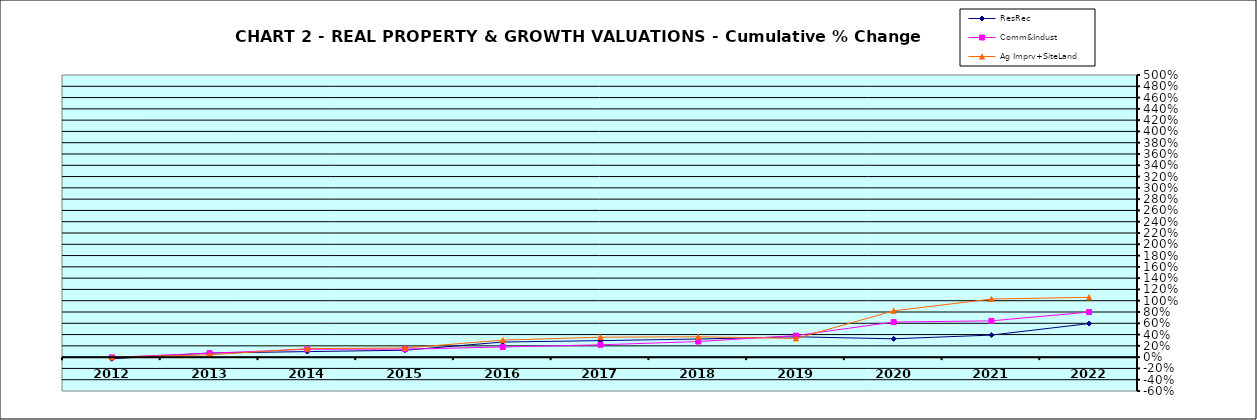
| Category | ResRec | Comm&Indust | Ag Imprv+SiteLand |
|---|---|---|---|
| 2012.0 | -0.029 | -0.004 | 0 |
| 2013.0 | 0.073 | 0.07 | 0.042 |
| 2014.0 | 0.098 | 0.14 | 0.151 |
| 2015.0 | 0.123 | 0.142 | 0.162 |
| 2016.0 | 0.268 | 0.18 | 0.302 |
| 2017.0 | 0.293 | 0.219 | 0.354 |
| 2018.0 | 0.321 | 0.276 | 0.361 |
| 2019.0 | 0.361 | 0.382 | 0.332 |
| 2020.0 | 0.325 | 0.622 | 0.82 |
| 2021.0 | 0.391 | 0.643 | 1.03 |
| 2022.0 | 0.595 | 0.799 | 1.061 |